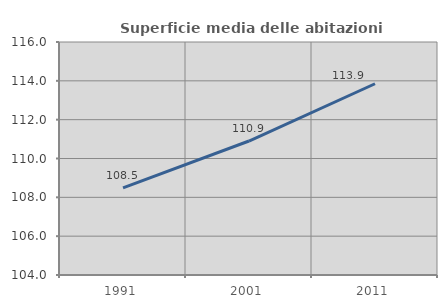
| Category | Superficie media delle abitazioni occupate |
|---|---|
| 1991.0 | 108.488 |
| 2001.0 | 110.9 |
| 2011.0 | 113.85 |